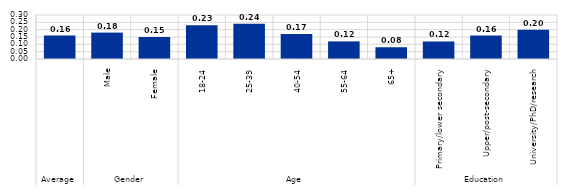
| Category | Series 0 |
|---|---|
| 0 | 0.16 |
| 1 | 0.18 |
| 2 | 0.15 |
| 3 | 0.23 |
| 4 | 0.24 |
| 5 | 0.17 |
| 6 | 0.12 |
| 7 | 0.08 |
| 8 | 0.12 |
| 9 | 0.16 |
| 10 | 0.2 |